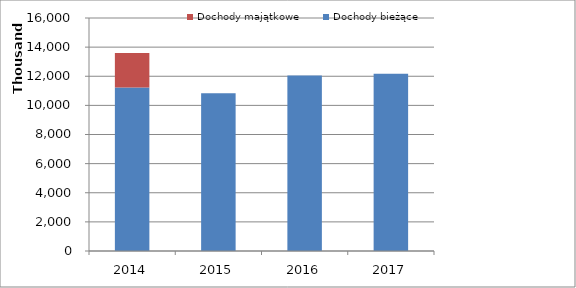
| Category | Dochody bieżące | Dochody majątkowe |
|---|---|---|
| 2014.0 | 11221741 | 2379904 |
| 2015.0 | 10825000 | 0 |
| 2016.0 | 12050000 | 0 |
| 2017.0 | 12170000 | 0 |